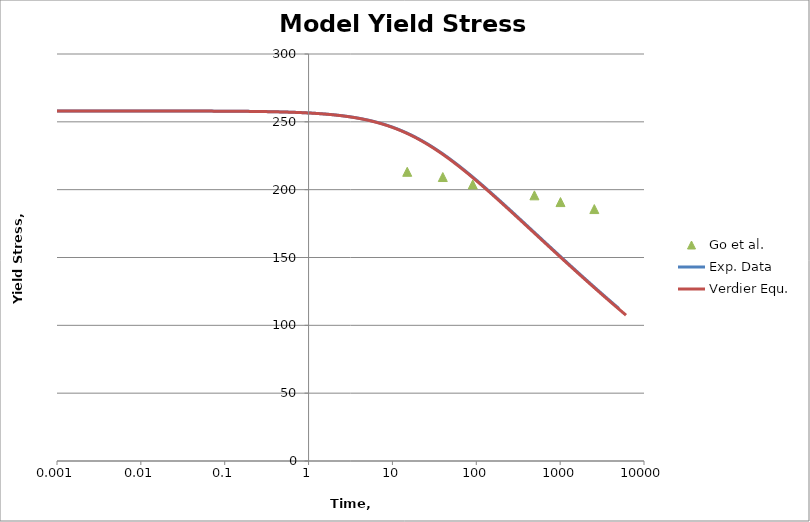
| Category | Go et al. |
|---|---|
| 0.0 | 258 |
| 15.012879542386322 | 213.172 |
| 39.8858636240404 | 209.317 |
| 90.77139294024566 | 203.855 |
| 493.4236936655811 | 195.823 |
| 1009.5550370813455 | 190.843 |
| 2555.524212115162 | 185.703 |